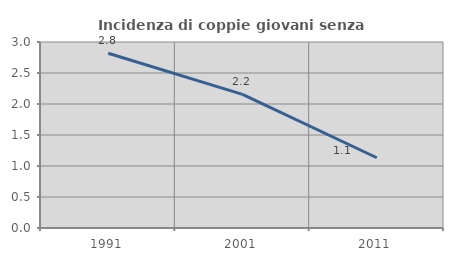
| Category | Incidenza di coppie giovani senza figli |
|---|---|
| 1991.0 | 2.818 |
| 2001.0 | 2.155 |
| 2011.0 | 1.133 |